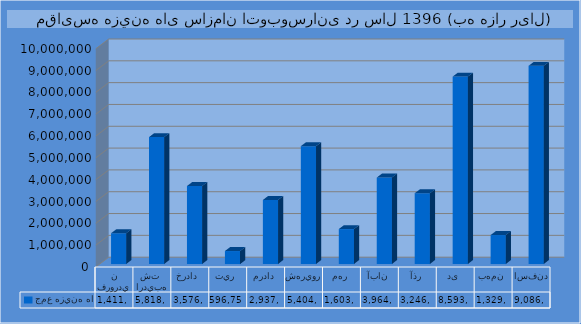
| Category | جمع هزينه ها |
|---|---|
| فروردين | 1411997 |
| ارديبهشت  | 5818308 |
| خرداد  | 3576376 |
| تير | 596758 |
| مرداد | 2937941 |
| شهريور | 5404598 |
| مهر | 1603246 |
| آبان | 3964982 |
| آذر | 3246372 |
| دی | 8593157 |
| بهمن | 1329863 |
| اسفند | 9086307 |